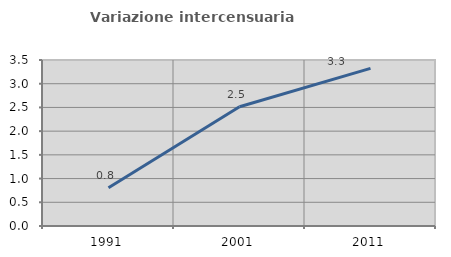
| Category | Variazione intercensuaria annua |
|---|---|
| 1991.0 | 0.806 |
| 2001.0 | 2.515 |
| 2011.0 | 3.322 |